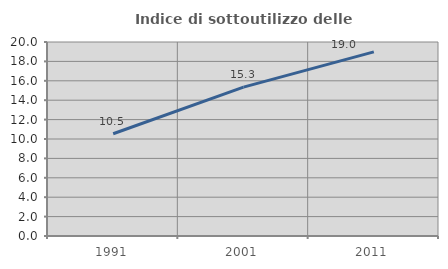
| Category | Indice di sottoutilizzo delle abitazioni  |
|---|---|
| 1991.0 | 10.538 |
| 2001.0 | 15.347 |
| 2011.0 | 18.98 |